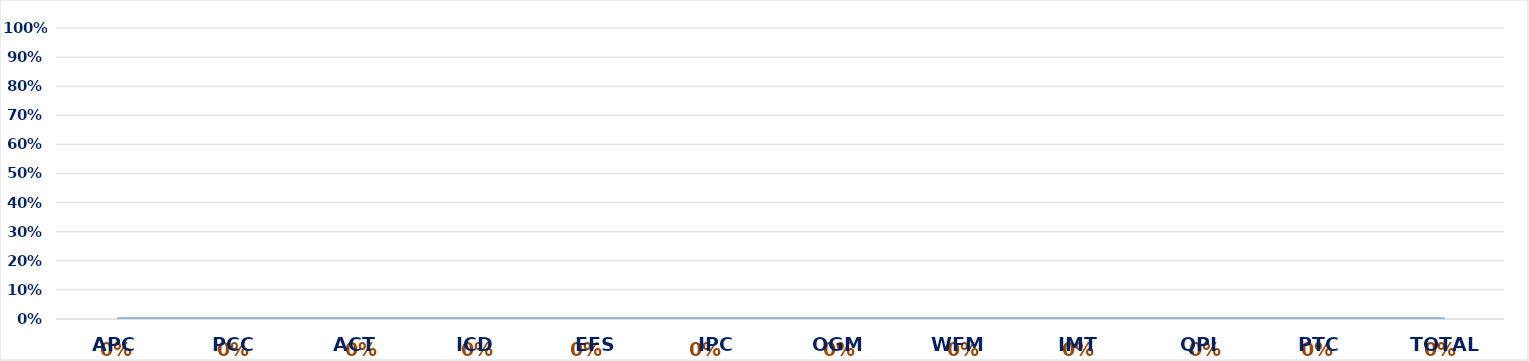
| Category | Series 0 |
|---|---|
| APC | 0 |
| PCC | 0 |
| ACT | 0 |
| ICD | 0 |
| EFS | 0 |
| IPC | 0 |
| OGM | 0 |
| WFM | 0 |
| IMT | 0 |
| QPI | 0 |
| PTC | 0 |
| TOTAL | 0 |